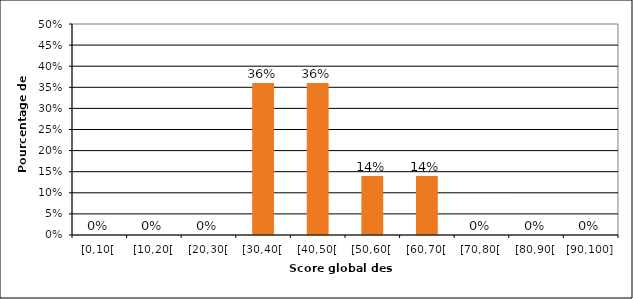
| Category | Series 0 |
|---|---|
| [0,10[ | 0 |
| [10,20[ | 0 |
| [20,30[ | 0 |
| [30,40[ | 0.36 |
| [40,50[ | 0.36 |
| [50,60[ | 0.14 |
| [60,70[ | 0.14 |
| [70,80[ | 0 |
| [80,90[ | 0 |
| [90,100] | 0 |